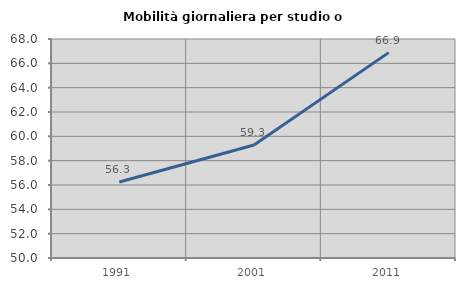
| Category | Mobilità giornaliera per studio o lavoro |
|---|---|
| 1991.0 | 56.251 |
| 2001.0 | 59.285 |
| 2011.0 | 66.881 |